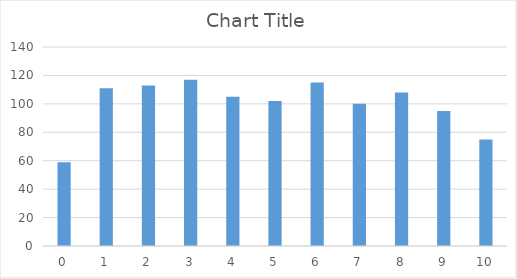
| Category | Series 0 |
|---|---|
| 0.0 | 59 |
| 1.0 | 111 |
| 2.0 | 113 |
| 3.0 | 117 |
| 4.0 | 105 |
| 5.0 | 102 |
| 6.0 | 115 |
| 7.0 | 100 |
| 8.0 | 108 |
| 9.0 | 95 |
| 10.0 | 75 |